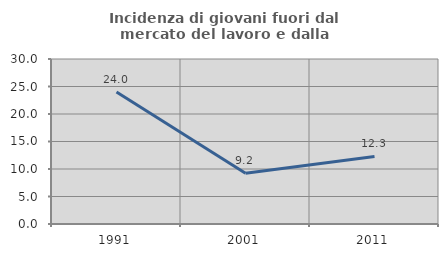
| Category | Incidenza di giovani fuori dal mercato del lavoro e dalla formazione  |
|---|---|
| 1991.0 | 24 |
| 2001.0 | 9.231 |
| 2011.0 | 12.281 |